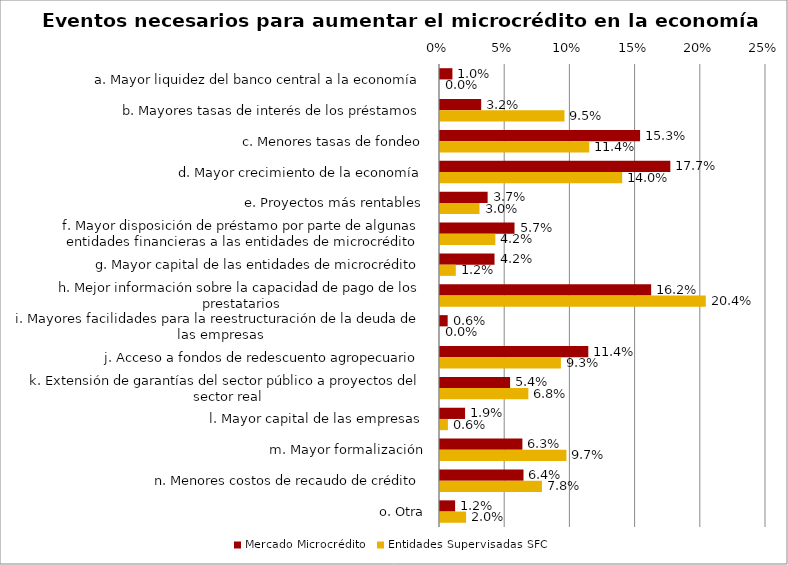
| Category | Mercado Microcrédito | Entidades Supervisadas SFC |
|---|---|---|
| a. Mayor liquidez del banco central a la economía | 0.01 | 0 |
| b. Mayores tasas de interés de los préstamos | 0.032 | 0.095 |
| c. Menores tasas de fondeo | 0.153 | 0.114 |
| d. Mayor crecimiento de la economía | 0.177 | 0.14 |
| e. Proyectos más rentables | 0.037 | 0.03 |
| f. Mayor disposición de préstamo por parte de algunas entidades financieras a las entidades de microcrédito | 0.057 | 0.042 |
| g. Mayor capital de las entidades de microcrédito | 0.042 | 0.012 |
| h. Mejor información sobre la capacidad de pago de los prestatarios | 0.162 | 0.204 |
| i. Mayores facilidades para la reestructuración de la deuda de las empresas | 0.006 | 0 |
| j. Acceso a fondos de redescuento agropecuario | 0.114 | 0.093 |
| k. Extensión de garantías del sector público a proyectos del sector real | 0.054 | 0.068 |
| l. Mayor capital de las empresas | 0.019 | 0.006 |
| m. Mayor formalización | 0.063 | 0.097 |
| n. Menores costos de recaudo de crédito | 0.064 | 0.078 |
| o. Otra | 0.012 | 0.02 |